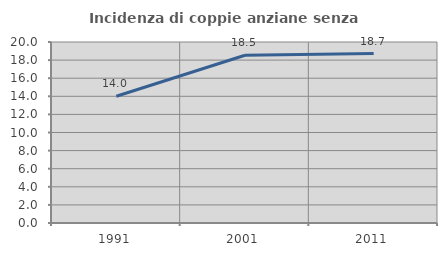
| Category | Incidenza di coppie anziane senza figli  |
|---|---|
| 1991.0 | 14.003 |
| 2001.0 | 18.534 |
| 2011.0 | 18.723 |